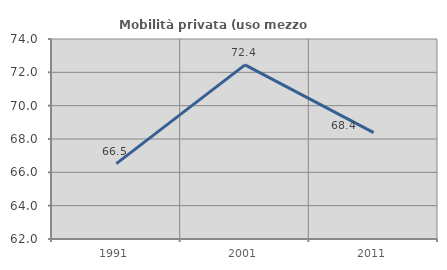
| Category | Mobilità privata (uso mezzo privato) |
|---|---|
| 1991.0 | 66.524 |
| 2001.0 | 72.444 |
| 2011.0 | 68.379 |